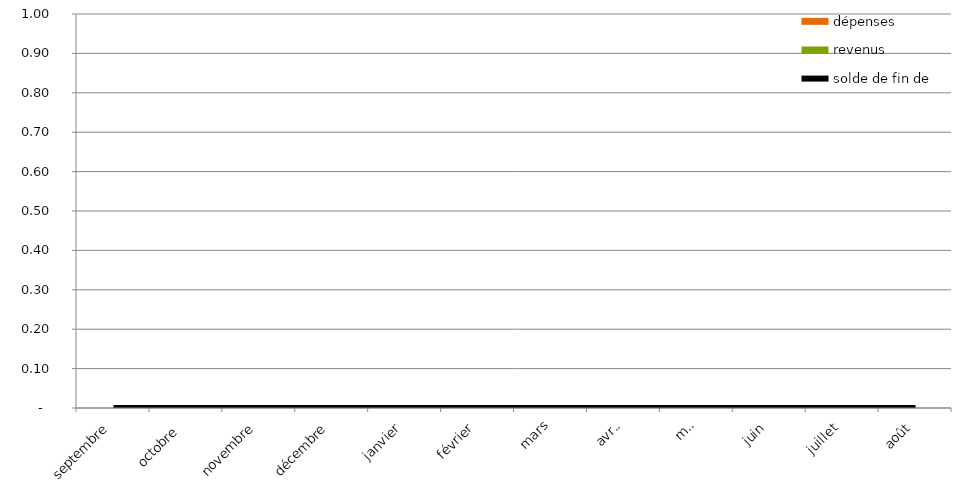
| Category | dépenses | revenus |
|---|---|---|
| septembre | 0 | 0 |
| octobre  | 0 | 0 |
| novembre | 0 | 0 |
| décembre | 0 | 0 |
| janvier | 0 | 0 |
| février | 0 | 0 |
| mars | 0 | 0 |
| avril | 0 | 0 |
| mai | 0 | 0 |
| juin | 0 | 0 |
| juillet | 0 | 0 |
| août | 0 | 0 |